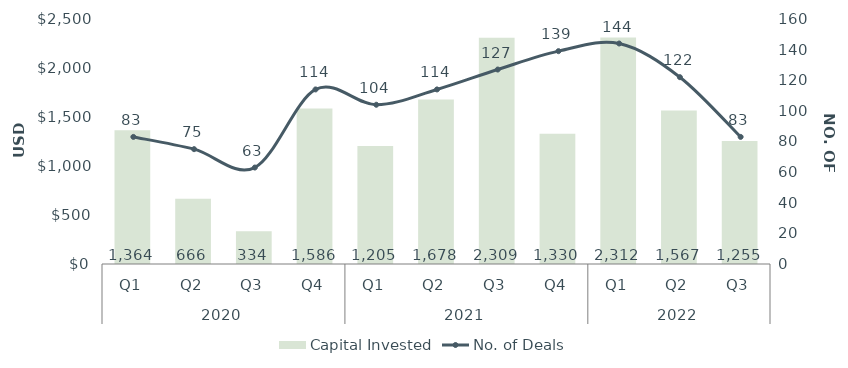
| Category | Capital Invested |
|---|---|
| 0 | 1363.952 |
| 1 | 665.859 |
| 2 | 334.281 |
| 3 | 1585.578 |
| 4 | 1204.958 |
| 5 | 1677.905 |
| 6 | 2308.732 |
| 7 | 1329.598 |
| 8 | 2311.736 |
| 9 | 1567.308 |
| 10 | 1254.813 |